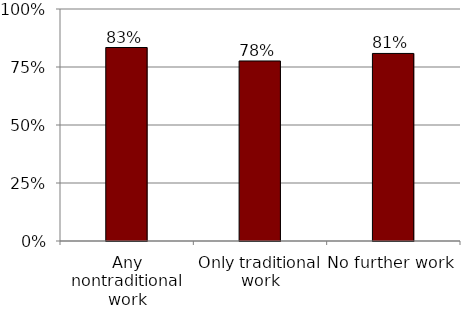
| Category | Series 0 |
|---|---|
| Any nontraditional work | 0.834 |
| Only traditional work | 0.776 |
| No further work | 0.808 |